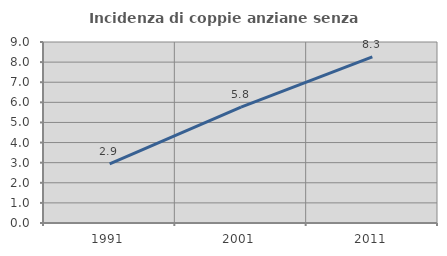
| Category | Incidenza di coppie anziane senza figli  |
|---|---|
| 1991.0 | 2.941 |
| 2001.0 | 5.764 |
| 2011.0 | 8.259 |